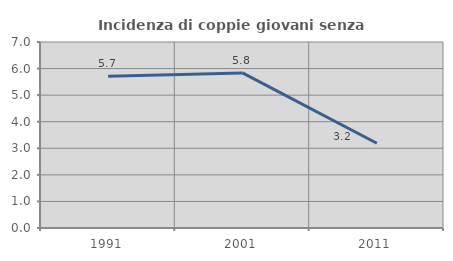
| Category | Incidenza di coppie giovani senza figli |
|---|---|
| 1991.0 | 5.715 |
| 2001.0 | 5.836 |
| 2011.0 | 3.191 |